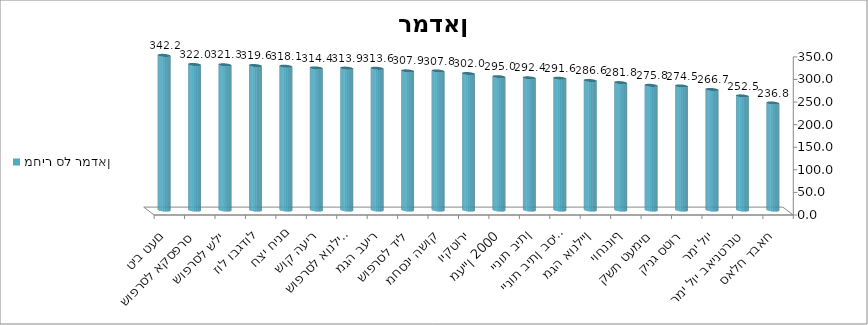
| Category | מחיר סל רמדאן |
|---|---|
| סאלח דבאח | 236.76 |
| רמי לוי באינטרנט | 252.5 |
| רמי לוי | 266.7 |
| קינג סטור | 274.5 |
| קשת טעמים | 275.83 |
| יוחננוף | 281.82 |
| מגה אונליין | 286.63 |
| יינות ביתן בסיטי | 291.57 |
| יינות ביתן | 292.43 |
| מעיין 2000 | 295.03 |
| ויקטורי | 301.95 |
| מחסני השוק | 307.76 |
| שופרסל דיל | 307.88 |
| מגה בעיר | 313.57 |
| שופרסל אונליין | 313.89 |
| שוק העיר | 314.41 |
| חצי חינם | 318.09 |
| זול ובגדול | 319.63 |
| שופרסל שלי | 321.26 |
| שופרסל אקספרס | 322.01 |
| טיב טעם | 342.15 |